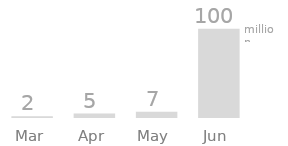
| Category | in million |
|---|---|
| 2013-03-01 | 2000000 |
| 2013-04-01 | 5000000 |
| 2013-05-01 | 7000000 |
| 2013-06-01 | 100000000 |